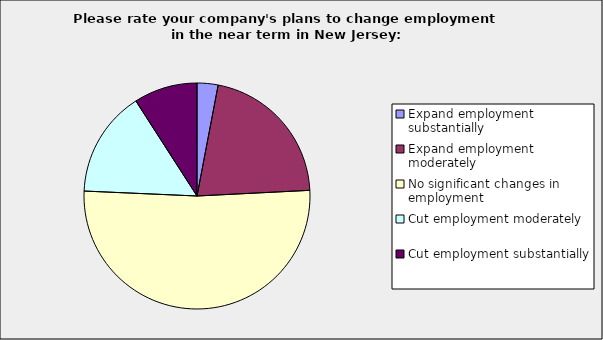
| Category | Series 0 |
|---|---|
| Expand employment substantially | 0.03 |
| Expand employment moderately | 0.212 |
| No significant changes in employment | 0.515 |
| Cut employment moderately | 0.152 |
| Cut employment substantially | 0.091 |